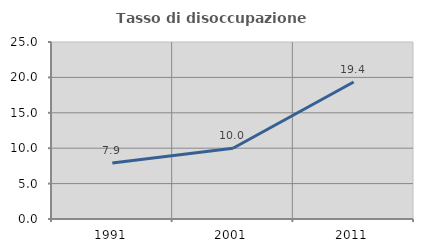
| Category | Tasso di disoccupazione giovanile  |
|---|---|
| 1991.0 | 7.895 |
| 2001.0 | 10 |
| 2011.0 | 19.355 |